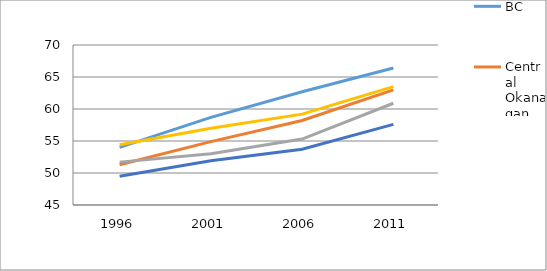
| Category | BC  | Central Okanagan | East Kootenay | Kootenay-Boundary | Thompson-Cariboo |
|---|---|---|---|---|---|
| 1996.0 | 54 | 51.3 | 51.7 | 54.4 | 49.5 |
| 2001.0 | 58.7 | 54.9 | 53 | 57 | 51.9 |
| 2006.0 | 62.7 | 58.2 | 55.3 | 59.2 | 53.7 |
| 2011.0 | 66.4 | 63 | 60.9 | 63.5 | 57.6 |